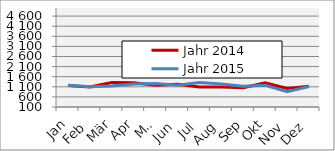
| Category | Jahr 2014 | Jahr 2015 |
|---|---|---|
| 0 | 1162.411 | 1175.129 |
| 1 | 1092.679 | 1101.133 |
| 2 | 1316.019 | 1145.174 |
| 3 | 1294.788 | 1234.845 |
| 4 | 1176.304 | 1264.251 |
| 5 | 1230.951 | 1177.365 |
| 6 | 1090.57 | 1317.654 |
| 7 | 1090.482 | 1233.559 |
| 8 | 1056.562 | 1130.489 |
| 9 | 1296.765 | 1178.812 |
| 10 | 1018.372 | 857.844 |
| 11 | 1122.811 | 1113.874 |